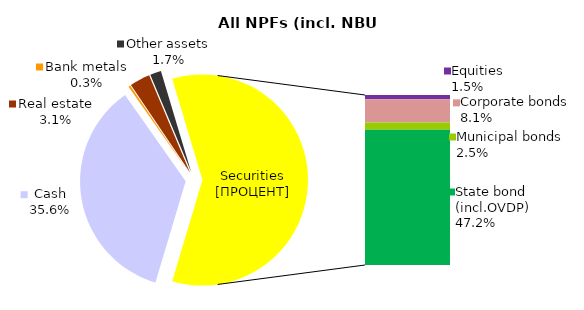
| Category | All NPF (incl. NBU CNPF)* |
|---|---|
| Cash | 1323.144 |
| Bank metals | 10.719 |
| Real estate | 115.995 |
| Other assets | 63.11 |
| Equities | 54.463 |
| Corporate bonds | 302.351 |
| Municipal bonds | 91.659 |
| State bond (incl.OVDP) | 1751.443 |